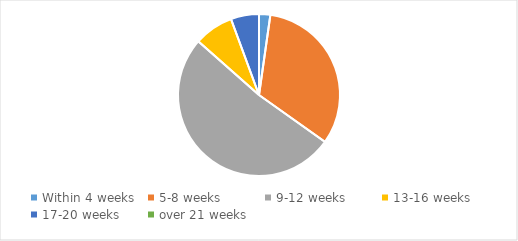
| Category | Series 0 |
|---|---|
| Within 4 weeks | 0.022 |
| 5-8 weeks | 0.326 |
| 9-12 weeks | 0.517 |
| 13-16 weeks | 0.079 |
| 17-20 weeks | 0.056 |
| over 21 weeks | 0 |